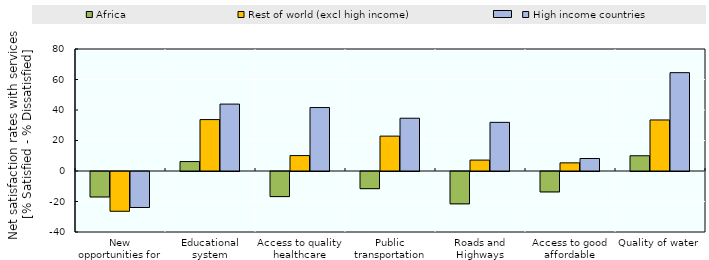
| Category | Africa | Rest of world (excl high income) | High income countries |
|---|---|---|---|
| New opportunities for jobs | -16.691 | -26.072 | -23.606 |
| Educational system | 6.189 | 33.718 | 43.874 |
| Access to quality healthcare | -16.458 | 10.11 | 41.607 |
| Public transportation systems | -11.252 | 22.879 | 34.608 |
| Roads and Highways | -21.207 | 7.157 | 31.897 |
| Access to good affordable housing | -13.387 | 5.339 | 8.205 |
| Quality of water | 9.999 | 33.465 | 64.487 |